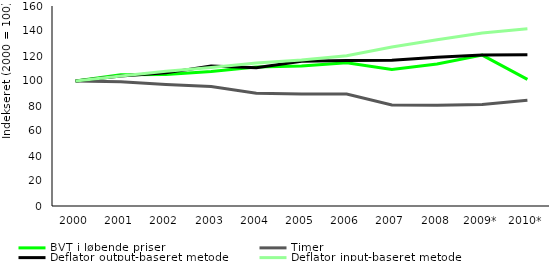
| Category | BVT i løbende priser | Timer | Deflator output-baseret metode | Deflator input-baseret metode |
|---|---|---|---|---|
| 2000 | 100 | 100 | 100 | 100 |
| 2001 | 105.073 | 99.452 | 104.001 | 103.913 |
| 2002 | 105.128 | 97.184 | 106.512 | 107.848 |
| 2003 | 107.569 | 95.535 | 111.914 | 110.783 |
| 2004 | 111.142 | 90.262 | 110.626 | 114.317 |
| 2005 | 111.926 | 89.593 | 115.719 | 116.728 |
| 2006 | 114.576 | 89.631 | 116.347 | 120.273 |
| 2007 | 109.27 | 80.868 | 116.626 | 127.201 |
| 2008 | 113.548 | 80.648 | 118.987 | 132.93 |
| 2009* | 120.706 | 81.297 | 120.785 | 138.477 |
| 2010* | 101.346 | 84.547 | 120.965 | 141.8 |